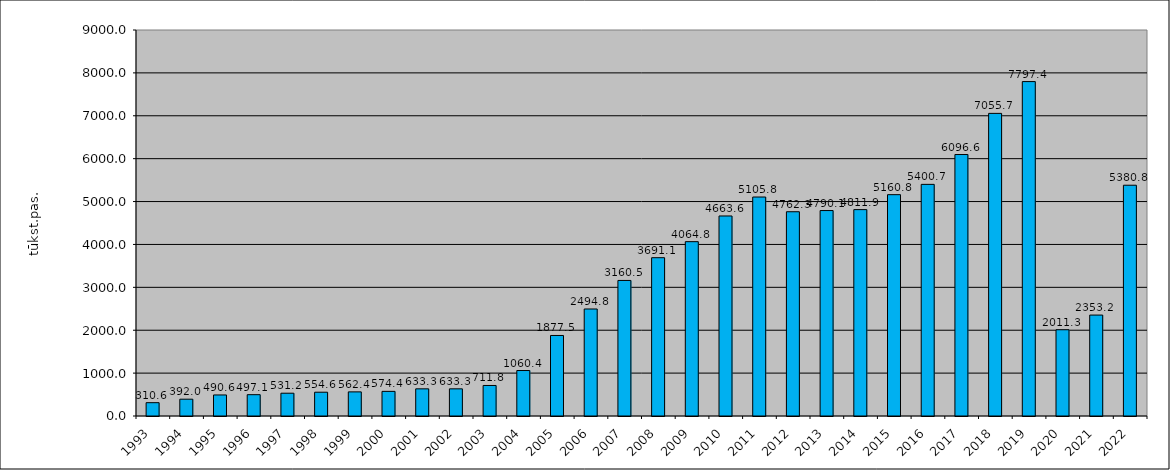
| Category | Series 1 |
|---|---|
| 1993.0 | 310.6 |
| 1994.0 | 392 |
| 1995.0 | 490.62 |
| 1996.0 | 497.13 |
| 1997.0 | 531.22 |
| 1998.0 | 554.62 |
| 1999.0 | 562.383 |
| 2000.0 | 574.356 |
| 2001.0 | 633.319 |
| 2002.0 | 633.319 |
| 2003.0 | 711.848 |
| 2004.0 | 1060.384 |
| 2005.0 | 1877.461 |
| 2006.0 | 2494.835 |
| 2007.0 | 3160.535 |
| 2008.0 | 3691.099 |
| 2009.0 | 4064.755 |
| 2010.0 | 4663.647 |
| 2011.0 | 5105.818 |
| 2012.0 | 4762.335 |
| 2013.0 | 4790.136 |
| 2014.0 | 4811.949 |
| 2015.0 | 5160.759 |
| 2016.0 | 5400.709 |
| 2017.0 | 6096.62 |
| 2018.0 | 7055.734 |
| 2019.0 | 7797.398 |
| 2020.0 | 2011.274 |
| 2021.0 | 2353.246 |
| 2022.0 | 5380.812 |